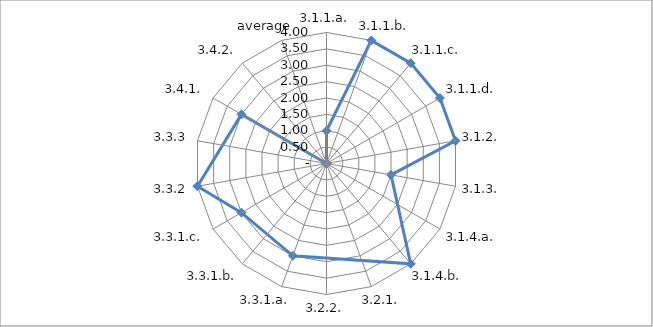
| Category | Series 0 |
|---|---|
| 3.1.1.a. | 1 |
| 3.1.1.b. | 4 |
| 3.1.1.c. | 4 |
| 3.1.1.d. | 4 |
| 3.1.2. | 4 |
| 3.1.3. | 2 |
| 3.1.4.a. | 0 |
| 3.1.4.b. | 4 |
| 3.2.1. | 0 |
| 3.2.2. | 0 |
| 3.3.1.a. | 3 |
| 3.3.1.b. | 0 |
| 3.3.1.c. | 3 |
| 3.3.2 | 4 |
| 3.3.3 | 0 |
| 3.4.1. | 3 |
| 3.4.2. | 0 |
| average | 0 |